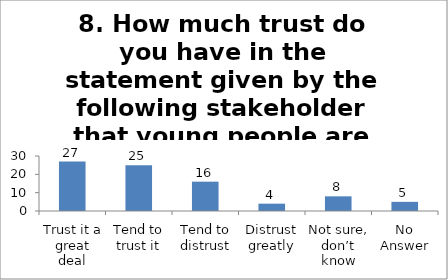
| Category | 8. How much trust do you have in the statement given by the following stakeholder that young people are our greatest assets to rebuild Pakistan?(Employers) |
|---|---|
| Trust it a great deal | 27 |
| Tend to trust it | 25 |
| Tend to distrust | 16 |
| Distrust greatly | 4 |
| Not sure, don’t know | 8 |
| No Answer | 5 |